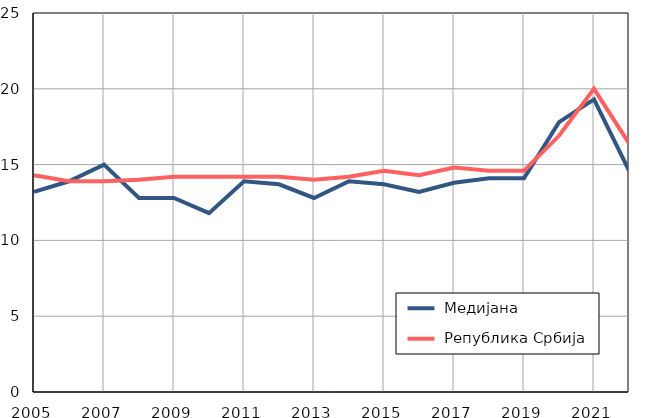
| Category |  Медијана |  Република Србија |
|---|---|---|
| 2005.0 | 13.2 | 14.3 |
| 2006.0 | 13.9 | 13.9 |
| 2007.0 | 15 | 13.9 |
| 2008.0 | 12.8 | 14 |
| 2009.0 | 12.8 | 14.2 |
| 2010.0 | 11.8 | 14.2 |
| 2011.0 | 13.9 | 14.2 |
| 2012.0 | 13.7 | 14.2 |
| 2013.0 | 12.8 | 14 |
| 2014.0 | 13.9 | 14.2 |
| 2015.0 | 13.7 | 14.6 |
| 2016.0 | 13.2 | 14.3 |
| 2017.0 | 13.8 | 14.8 |
| 2018.0 | 14.1 | 14.6 |
| 2019.0 | 14.1 | 14.6 |
| 2020.0 | 17.8 | 16.9 |
| 2021.0 | 19.3 | 20 |
| 2022.0 | 14.6 | 16.4 |